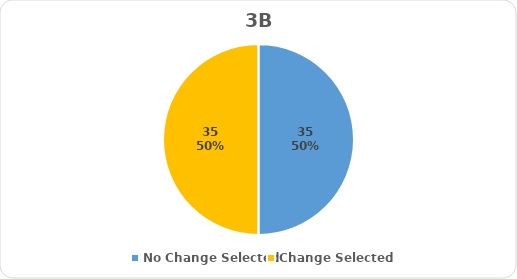
| Category | Series 0 |
|---|---|
| No Change Selected | 35 |
| Change Selected | 35 |